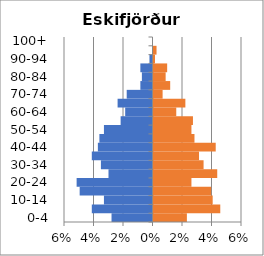
| Category | % Men | % Women |
|---|---|---|
| 0-4 | -0.028 | 0.023 |
| 5-9 | -0.041 | 0.045 |
| 10-14 | -0.033 | 0.04 |
| 15-19 | -0.049 | 0.039 |
| 20-24 | -0.051 | 0.026 |
| 25-29 | -0.03 | 0.043 |
| 30-34 | -0.035 | 0.034 |
| 35-39 | -0.041 | 0.031 |
| 40-44 | -0.037 | 0.042 |
| 45-49 | -0.036 | 0.028 |
| 50-54 | -0.033 | 0.026 |
| 55-59 | -0.022 | 0.027 |
| 60-64 | -0.019 | 0.015 |
| 65-69 | -0.024 | 0.022 |
| 70-74 | -0.017 | 0.006 |
| 75-79 | -0.008 | 0.011 |
| 80-84 | -0.007 | 0.008 |
| 85-89 | -0.008 | 0.009 |
| 90-94 | -0.002 | 0.001 |
| 95-99 | 0 | 0.002 |
| 100+ | 0 | 0 |